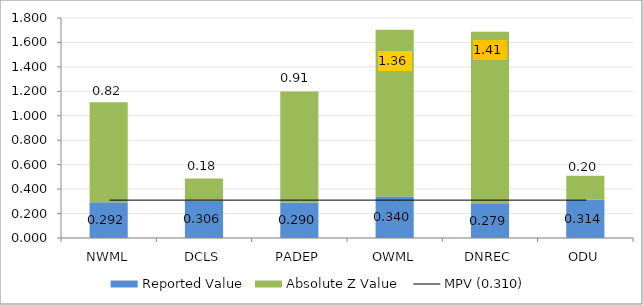
| Category | Reported Value | Absolute Z Value  |
|---|---|---|
| NWML | 0.292 | 0.818 |
| DCLS | 0.306 | 0.182 |
| PADEP | 0.29 | 0.909 |
| OWML | 0.34 | 1.364 |
| DNREC | 0.279 | 1.409 |
| ODU | 0.314 | 0.195 |